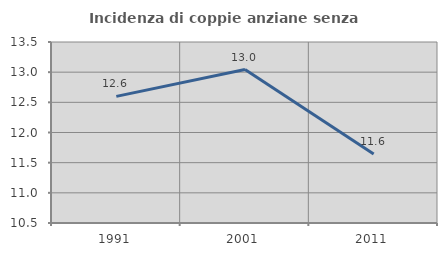
| Category | Incidenza di coppie anziane senza figli  |
|---|---|
| 1991.0 | 12.598 |
| 2001.0 | 13.043 |
| 2011.0 | 11.642 |